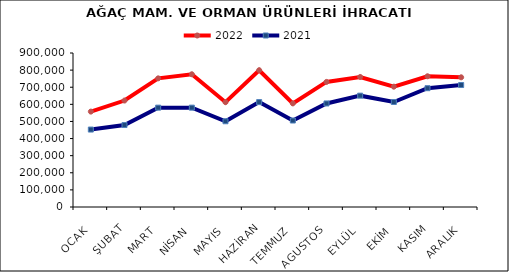
| Category | 2022 | 2021 |
|---|---|---|
| OCAK | 557501.981 | 452623.849 |
| ŞUBAT | 622166.262 | 479071.421 |
| MART | 751893.485 | 580656.743 |
| NİSAN | 775790.704 | 580638.044 |
| MAYIS | 612483.208 | 501065.424 |
| HAZİRAN | 799388.607 | 613074.04 |
| TEMMUZ | 605497.077 | 505401.991 |
| AGUSTOS | 730989.135 | 605133.602 |
| EYLÜL | 759872.904 | 650656.738 |
| EKİM | 703168.121 | 613673.096 |
| KASIM | 764052.075 | 694274.458 |
| ARALIK | 757962.816 | 712894.751 |